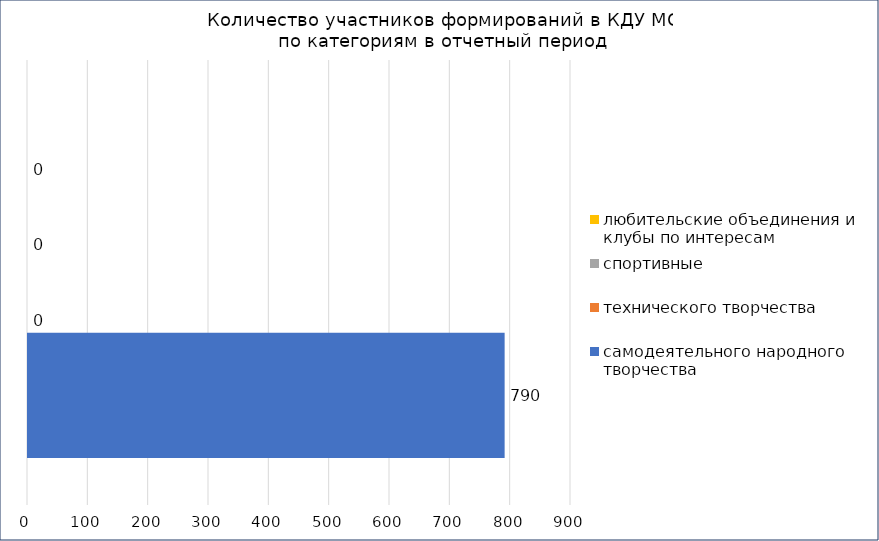
| Category | самодеятельного народного творчества | технического творчества | спортивные | любительские объединения и клубы по интересам |
|---|---|---|---|---|
| 0 | 790 | 0 | 0 | 0 |